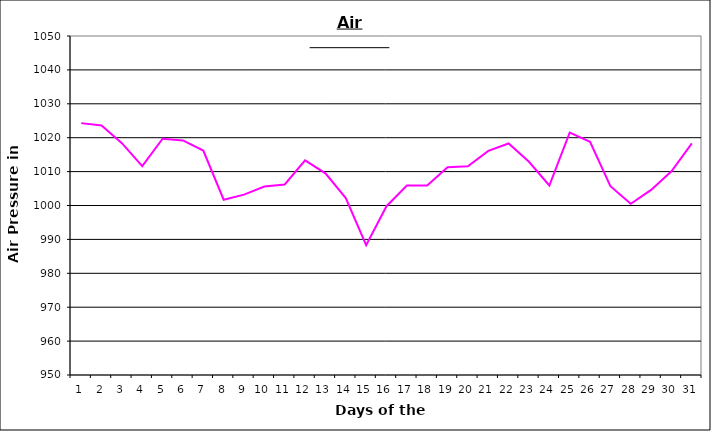
| Category | Series 0 |
|---|---|
| 0 | 1024.3 |
| 1 | 1023.6 |
| 2 | 1018.4 |
| 3 | 1011.6 |
| 4 | 1019.7 |
| 5 | 1019.2 |
| 6 | 1016.2 |
| 7 | 1001.7 |
| 8 | 1003.2 |
| 9 | 1005.6 |
| 10 | 1006.2 |
| 11 | 1013.3 |
| 12 | 1009.5 |
| 13 | 1002.2 |
| 14 | 988.3 |
| 15 | 999.8 |
| 16 | 1005.9 |
| 17 | 1005.9 |
| 18 | 1011.3 |
| 19 | 1011.6 |
| 20 | 1016.1 |
| 21 | 1018.3 |
| 22 | 1012.9 |
| 23 | 1005.9 |
| 24 | 1021.5 |
| 25 | 1018.8 |
| 26 | 1005.7 |
| 27 | 1000.5 |
| 28 | 1004.6 |
| 29 | 1010.1 |
| 30 | 1018.3 |